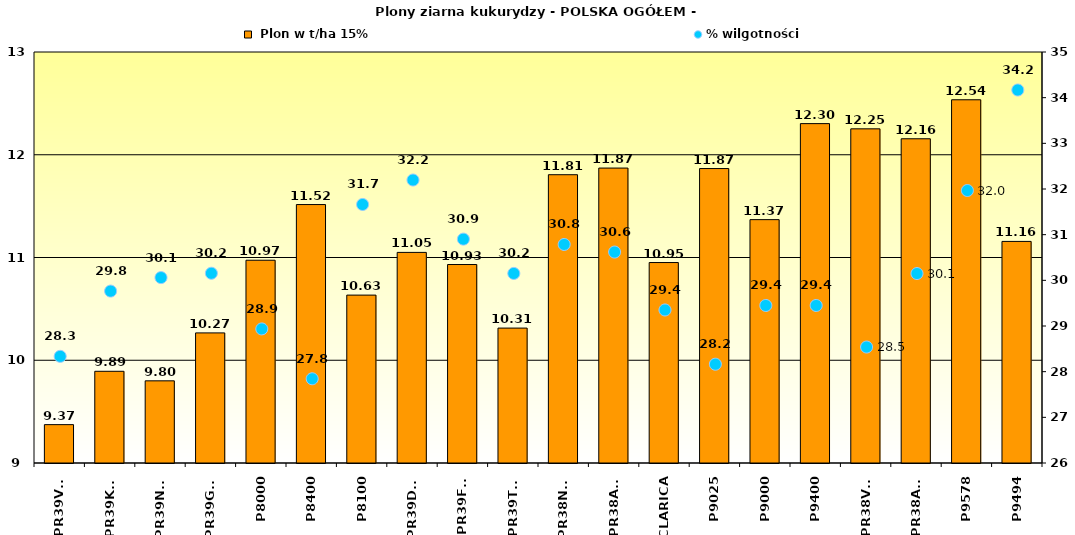
| Category |  Plon w t/ha 15% |
|---|---|
| PR39V43 | 9.373 |
| PR39K13 | 9.893 |
| PR39N39 | 9.8 |
| PR39G12 | 10.266 |
| P8000 | 10.973 |
| P8400 | 11.515 |
| P8100 | 10.634 |
| PR39D23 | 11.05 |
| PR39F58 | 10.932 |
| PR39T83 | 10.313 |
| PR38N86 | 11.806 |
| PR38A79 | 11.87 |
| CLARICA | 10.951 |
| P9025 | 11.866 |
| P9000 | 11.368 |
| P9400 | 12.303 |
| PR38V31 | 12.252 |
| PR38A24 | 12.155 |
| P9578 | 12.535 |
| P9494 | 11.157 |